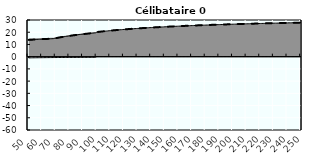
| Category | Coin fiscal moyen (somme des composantes) | Taux moyen d'imposition net en % du salaire brut |
|---|---|---|
| 50.0 | 13.732 | 13.732 |
| 51.0 | 13.806 | 13.806 |
| 52.0 | 13.877 | 13.877 |
| 53.0 | 13.945 | 13.945 |
| 54.0 | 14.011 | 14.011 |
| 55.0 | 14.074 | 14.074 |
| 56.0 | 14.135 | 14.135 |
| 57.0 | 14.194 | 14.194 |
| 58.0 | 14.251 | 14.251 |
| 59.0 | 14.306 | 14.306 |
| 60.0 | 14.36 | 14.36 |
| 61.0 | 14.411 | 14.411 |
| 62.0 | 14.461 | 14.461 |
| 63.0 | 14.509 | 14.509 |
| 64.0 | 14.556 | 14.556 |
| 65.0 | 14.601 | 14.601 |
| 66.0 | 14.645 | 14.645 |
| 67.0 | 14.688 | 14.688 |
| 68.0 | 14.729 | 14.729 |
| 69.0 | 14.95 | 14.95 |
| 70.0 | 15.165 | 15.165 |
| 71.0 | 15.374 | 15.374 |
| 72.0 | 15.577 | 15.577 |
| 73.0 | 15.775 | 15.775 |
| 74.0 | 15.967 | 15.967 |
| 75.0 | 16.154 | 16.154 |
| 76.0 | 16.337 | 16.337 |
| 77.0 | 16.514 | 16.514 |
| 78.0 | 16.687 | 16.687 |
| 79.0 | 16.855 | 16.855 |
| 80.0 | 17.02 | 17.02 |
| 81.0 | 17.18 | 17.18 |
| 82.0 | 17.336 | 17.336 |
| 83.0 | 17.489 | 17.489 |
| 84.0 | 17.638 | 17.638 |
| 85.0 | 17.783 | 17.783 |
| 86.0 | 17.925 | 17.925 |
| 87.0 | 18.064 | 18.064 |
| 88.0 | 18.2 | 18.2 |
| 89.0 | 18.332 | 18.332 |
| 90.0 | 18.462 | 18.462 |
| 91.0 | 18.589 | 18.589 |
| 92.0 | 18.713 | 18.713 |
| 93.0 | 18.834 | 18.834 |
| 94.0 | 18.953 | 18.953 |
| 95.0 | 19.069 | 19.069 |
| 96.0 | 19.183 | 19.183 |
| 97.0 | 19.295 | 19.295 |
| 98.0 | 19.404 | 19.404 |
| 99.0 | 19.511 | 19.511 |
| 100.0 | 20.137 | 20.137 |
| 101.0 | 20.264 | 20.264 |
| 102.0 | 20.389 | 20.389 |
| 103.0 | 20.511 | 20.511 |
| 104.0 | 20.631 | 20.631 |
| 105.0 | 20.749 | 20.749 |
| 106.0 | 20.865 | 20.865 |
| 107.0 | 20.978 | 20.978 |
| 108.0 | 21.089 | 21.089 |
| 109.0 | 21.199 | 21.199 |
| 110.0 | 21.306 | 21.306 |
| 111.0 | 21.411 | 21.411 |
| 112.0 | 21.515 | 21.515 |
| 113.0 | 21.616 | 21.616 |
| 114.0 | 21.716 | 21.716 |
| 115.0 | 21.814 | 21.814 |
| 116.0 | 21.911 | 21.911 |
| 117.0 | 22.006 | 22.006 |
| 118.0 | 22.099 | 22.099 |
| 119.0 | 22.19 | 22.19 |
| 120.0 | 22.281 | 22.281 |
| 121.0 | 22.369 | 22.369 |
| 122.0 | 22.456 | 22.456 |
| 123.0 | 22.542 | 22.542 |
| 124.0 | 22.626 | 22.626 |
| 125.0 | 22.709 | 22.709 |
| 126.0 | 22.791 | 22.791 |
| 127.0 | 22.871 | 22.871 |
| 128.0 | 22.95 | 22.95 |
| 129.0 | 23.028 | 23.028 |
| 130.0 | 23.105 | 23.105 |
| 131.0 | 23.181 | 23.181 |
| 132.0 | 23.255 | 23.255 |
| 133.0 | 23.328 | 23.328 |
| 134.0 | 23.4 | 23.4 |
| 135.0 | 23.472 | 23.472 |
| 136.0 | 23.542 | 23.542 |
| 137.0 | 23.611 | 23.611 |
| 138.0 | 23.679 | 23.679 |
| 139.0 | 23.746 | 23.746 |
| 140.0 | 23.812 | 23.812 |
| 141.0 | 23.877 | 23.877 |
| 142.0 | 23.941 | 23.941 |
| 143.0 | 24.005 | 24.005 |
| 144.0 | 24.067 | 24.067 |
| 145.0 | 24.129 | 24.129 |
| 146.0 | 24.189 | 24.189 |
| 147.0 | 24.249 | 24.249 |
| 148.0 | 24.309 | 24.309 |
| 149.0 | 24.367 | 24.367 |
| 150.0 | 24.424 | 24.424 |
| 151.0 | 24.481 | 24.481 |
| 152.0 | 24.537 | 24.537 |
| 153.0 | 24.593 | 24.593 |
| 154.0 | 24.647 | 24.647 |
| 155.0 | 24.701 | 24.701 |
| 156.0 | 24.754 | 24.754 |
| 157.0 | 24.807 | 24.807 |
| 158.0 | 24.859 | 24.859 |
| 159.0 | 24.91 | 24.91 |
| 160.0 | 24.96 | 24.96 |
| 161.0 | 25.01 | 25.01 |
| 162.0 | 25.06 | 25.06 |
| 163.0 | 25.108 | 25.108 |
| 164.0 | 25.156 | 25.156 |
| 165.0 | 25.204 | 25.204 |
| 166.0 | 25.251 | 25.251 |
| 167.0 | 25.297 | 25.297 |
| 168.0 | 25.343 | 25.343 |
| 169.0 | 25.389 | 25.389 |
| 170.0 | 25.433 | 25.433 |
| 171.0 | 25.478 | 25.478 |
| 172.0 | 25.521 | 25.521 |
| 173.0 | 25.565 | 25.565 |
| 174.0 | 25.607 | 25.607 |
| 175.0 | 25.649 | 25.649 |
| 176.0 | 25.691 | 25.691 |
| 177.0 | 25.733 | 25.733 |
| 178.0 | 25.773 | 25.773 |
| 179.0 | 25.814 | 25.814 |
| 180.0 | 25.854 | 25.854 |
| 181.0 | 25.893 | 25.893 |
| 182.0 | 25.932 | 25.932 |
| 183.0 | 25.971 | 25.971 |
| 184.0 | 26.009 | 26.009 |
| 185.0 | 26.047 | 26.047 |
| 186.0 | 26.084 | 26.084 |
| 187.0 | 26.121 | 26.121 |
| 188.0 | 26.158 | 26.158 |
| 189.0 | 26.194 | 26.194 |
| 190.0 | 26.23 | 26.23 |
| 191.0 | 26.265 | 26.265 |
| 192.0 | 26.3 | 26.3 |
| 193.0 | 26.335 | 26.335 |
| 194.0 | 26.369 | 26.369 |
| 195.0 | 26.403 | 26.403 |
| 196.0 | 26.437 | 26.437 |
| 197.0 | 26.47 | 26.47 |
| 198.0 | 26.503 | 26.503 |
| 199.0 | 26.536 | 26.536 |
| 200.0 | 26.568 | 26.568 |
| 201.0 | 26.6 | 26.6 |
| 202.0 | 26.632 | 26.632 |
| 203.0 | 26.663 | 26.663 |
| 204.0 | 26.694 | 26.694 |
| 205.0 | 26.725 | 26.725 |
| 206.0 | 26.756 | 26.756 |
| 207.0 | 26.786 | 26.786 |
| 208.0 | 26.816 | 26.816 |
| 209.0 | 26.845 | 26.845 |
| 210.0 | 26.875 | 26.875 |
| 211.0 | 26.904 | 26.904 |
| 212.0 | 26.932 | 26.932 |
| 213.0 | 26.961 | 26.961 |
| 214.0 | 26.989 | 26.989 |
| 215.0 | 27.017 | 27.017 |
| 216.0 | 27.045 | 27.045 |
| 217.0 | 27.072 | 27.072 |
| 218.0 | 27.099 | 27.099 |
| 219.0 | 27.126 | 27.126 |
| 220.0 | 27.153 | 27.153 |
| 221.0 | 27.179 | 27.179 |
| 222.0 | 27.206 | 27.206 |
| 223.0 | 27.232 | 27.232 |
| 224.0 | 27.257 | 27.257 |
| 225.0 | 27.283 | 27.283 |
| 226.0 | 27.308 | 27.308 |
| 227.0 | 27.333 | 27.333 |
| 228.0 | 27.358 | 27.358 |
| 229.0 | 27.383 | 27.383 |
| 230.0 | 27.407 | 27.407 |
| 231.0 | 27.431 | 27.431 |
| 232.0 | 27.455 | 27.455 |
| 233.0 | 27.479 | 27.479 |
| 234.0 | 27.503 | 27.503 |
| 235.0 | 27.526 | 27.526 |
| 236.0 | 27.549 | 27.549 |
| 237.0 | 27.572 | 27.572 |
| 238.0 | 27.595 | 27.595 |
| 239.0 | 27.618 | 27.618 |
| 240.0 | 27.64 | 27.64 |
| 241.0 | 27.662 | 27.662 |
| 242.0 | 27.685 | 27.685 |
| 243.0 | 27.706 | 27.706 |
| 244.0 | 27.728 | 27.728 |
| 245.0 | 27.75 | 27.75 |
| 246.0 | 27.771 | 27.771 |
| 247.0 | 27.792 | 27.792 |
| 248.0 | 27.813 | 27.813 |
| 249.0 | 27.834 | 27.834 |
| 250.0 | 27.855 | 27.855 |